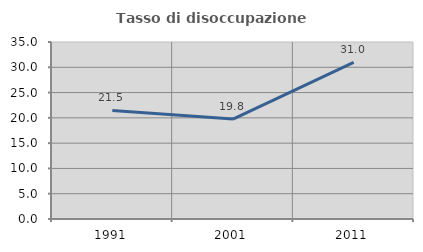
| Category | Tasso di disoccupazione giovanile  |
|---|---|
| 1991.0 | 21.472 |
| 2001.0 | 19.767 |
| 2011.0 | 30.986 |